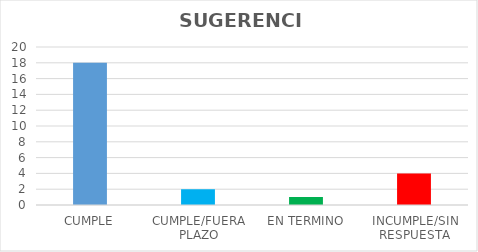
| Category | TOTAL |
|---|---|
| CUMPLE | 18 |
| CUMPLE/FUERA PLAZO | 2 |
| EN TERMINO | 1 |
| INCUMPLE/SIN RESPUESTA | 4 |